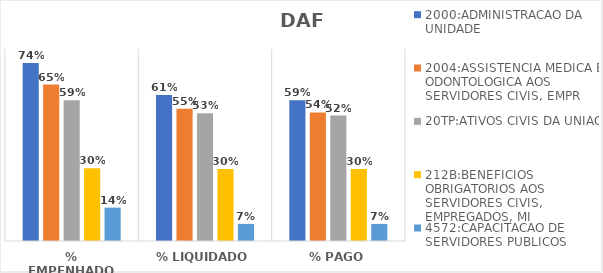
| Category | 2000:ADMINISTRACAO DA UNIDADE | 2004:ASSISTENCIA MEDICA E ODONTOLOGICA AOS SERVIDORES CIVIS, EMPR | 20TP:ATIVOS CIVIS DA UNIAO | 212B:BENEFICIOS OBRIGATORIOS AOS SERVIDORES CIVIS, EMPREGADOS, MI | 4572:CAPACITACAO DE SERVIDORES PUBLICOS FEDERAIS EM PROCESSO DE Q |
|---|---|---|---|---|---|
| % EMPENHADO | 0.742 | 0.652 | 0.587 | 0.303 | 0.139 |
| % LIQUIDADO | 0.608 | 0.552 | 0.532 | 0.3 | 0.071 |
| % PAGO | 0.586 | 0.536 | 0.522 | 0.3 | 0.071 |